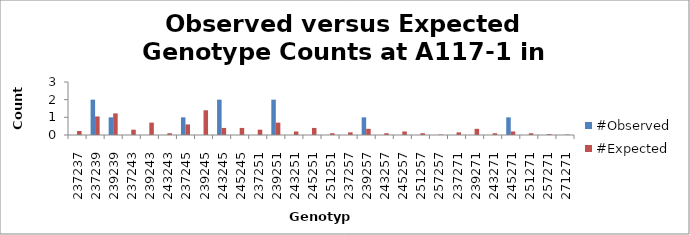
| Category | #Observed | #Expected |
|---|---|---|
| 237237.0 | 0 | 0.225 |
| 237239.0 | 2 | 1.05 |
| 239239.0 | 1 | 1.225 |
| 237243.0 | 0 | 0.3 |
| 239243.0 | 0 | 0.7 |
| 243243.0 | 0 | 0.1 |
| 237245.0 | 1 | 0.6 |
| 239245.0 | 0 | 1.4 |
| 243245.0 | 2 | 0.4 |
| 245245.0 | 0 | 0.4 |
| 237251.0 | 0 | 0.3 |
| 239251.0 | 2 | 0.7 |
| 243251.0 | 0 | 0.2 |
| 245251.0 | 0 | 0.4 |
| 251251.0 | 0 | 0.1 |
| 237257.0 | 0 | 0.15 |
| 239257.0 | 1 | 0.35 |
| 243257.0 | 0 | 0.1 |
| 245257.0 | 0 | 0.2 |
| 251257.0 | 0 | 0.1 |
| 257257.0 | 0 | 0.025 |
| 237271.0 | 0 | 0.15 |
| 239271.0 | 0 | 0.35 |
| 243271.0 | 0 | 0.1 |
| 245271.0 | 1 | 0.2 |
| 251271.0 | 0 | 0.1 |
| 257271.0 | 0 | 0.05 |
| 271271.0 | 0 | 0.025 |